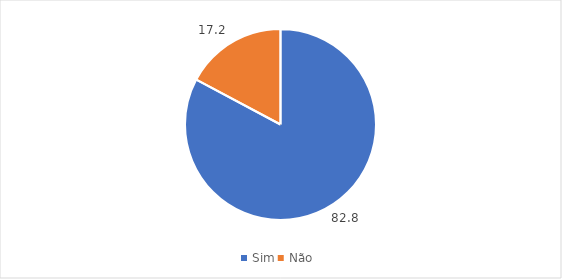
| Category | Series 0 |
|---|---|
| Sim | 82.8 |
| Não  | 17.2 |